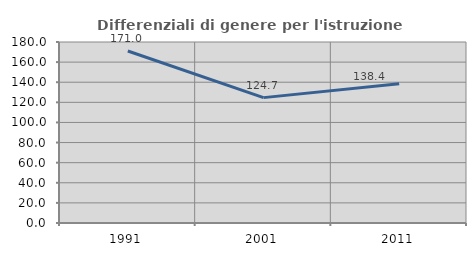
| Category | Differenziali di genere per l'istruzione superiore |
|---|---|
| 1991.0 | 171.007 |
| 2001.0 | 124.678 |
| 2011.0 | 138.392 |